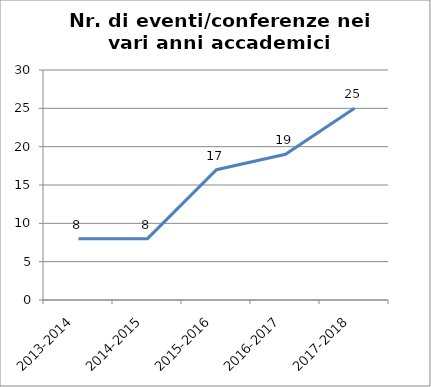
| Category | Nr. Eventi/Conferenze |
|---|---|
| 2013-2014 | 8 |
| 2014-2015 | 8 |
| 2015-2016 | 17 |
| 2016-2017 | 19 |
| 2017-2018 | 25 |